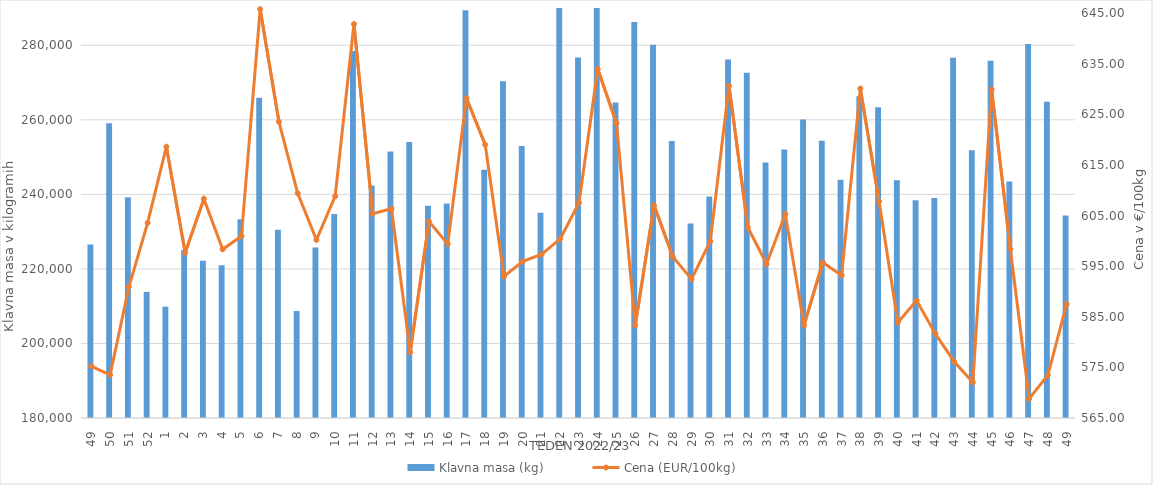
| Category | Klavna masa (kg) |
|---|---|
| 49.0 | 226575 |
| 50.0 | 259073 |
| 51.0 | 239211 |
| 52.0 | 213841 |
| 1.0 | 209877 |
| 2.0 | 225045 |
| 3.0 | 222198 |
| 4.0 | 221002 |
| 5.0 | 233306 |
| 6.0 | 265944 |
| 7.0 | 230531 |
| 8.0 | 208699 |
| 9.0 | 225712 |
| 10.0 | 234762 |
| 11.0 | 278467 |
| 12.0 | 242369 |
| 13.0 | 251507 |
| 14.0 | 254072 |
| 15.0 | 236964 |
| 16.0 | 237552 |
| 17.0 | 289400 |
| 18.0 | 246616 |
| 19.0 | 270374 |
| 20.0 | 252984 |
| 21.0 | 235060 |
| 22.0 | 290816 |
| 23.0 | 276702 |
| 24.0 | 292976 |
| 25.0 | 264669 |
| 26.0 | 286237 |
| 27.0 | 280112 |
| 28.0 | 254336 |
| 29.0 | 232178 |
| 30.0 | 239437 |
| 31.0 | 276163 |
| 32.0 | 272647 |
| 33.0 | 248536 |
| 34.0 | 252050 |
| 35.0 | 260110 |
| 36.0 | 254389 |
| 37.0 | 243933 |
| 38.0 | 266321 |
| 39.0 | 263346 |
| 40.0 | 243765 |
| 41.0 | 238404 |
| 42.0 | 239007 |
| 43.0 | 276684 |
| 44.0 | 251832 |
| 45.0 | 275816 |
| 46.0 | 243425 |
| 47.0 | 280350 |
| 48.0 | 264849 |
| 49.0 | 234308 |